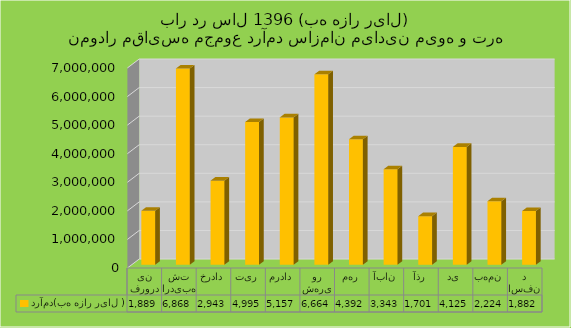
| Category | درآمد(به هزار ریال ) |
|---|---|
| فروردین | 1889557 |
| اردیبهشت | 6868051 |
| خرداد | 2943501 |
| تیر | 4995845 |
| مرداد | 5157309 |
| شهریور | 6664214 |
| مهر | 4392251 |
| آبان | 3343440 |
| آذر | 1701299 |
| دی | 4125389 |
| بهمن | 2224564 |
| اسفند | 1882662 |